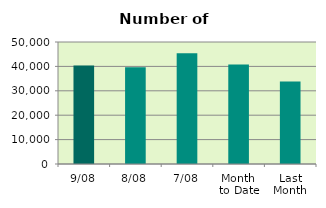
| Category | Series 0 |
|---|---|
| 9/08 | 40348 |
| 8/08 | 39642 |
| 7/08 | 45392 |
| Month 
to Date | 40732.286 |
| Last
Month | 33803.652 |